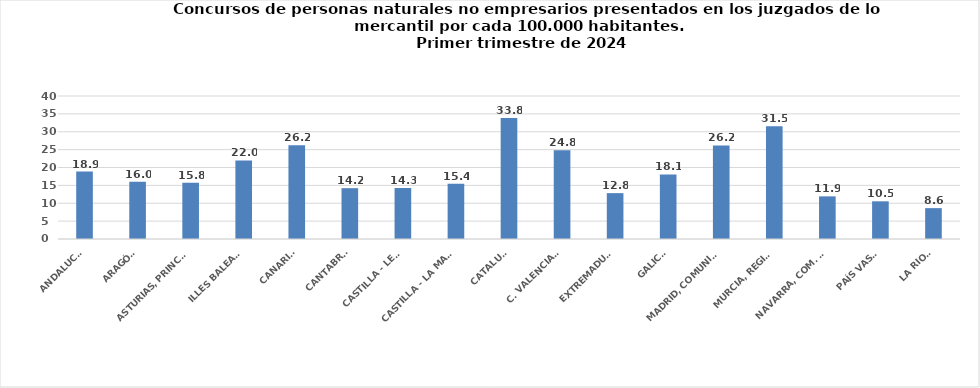
| Category | Series 0 |
|---|---|
| ANDALUCÍA | 18.853 |
| ARAGÓN | 16.038 |
| ASTURIAS, PRINCIPADO | 15.769 |
| ILLES BALEARS | 21.959 |
| CANARIAS | 26.198 |
| CANTABRIA | 14.213 |
| CASTILLA - LEÓN | 14.273 |
| CASTILLA - LA MANCHA | 15.45 |
| CATALUÑA | 33.814 |
| C. VALENCIANA | 24.82 |
| EXTREMADURA | 12.83 |
| GALICIA | 18.07 |
| MADRID, COMUNIDAD | 26.176 |
| MURCIA, REGIÓN | 31.542 |
| NAVARRA, COM. FORAL | 11.926 |
| PAÍS VASCO | 10.538 |
| LA RIOJA | 8.633 |